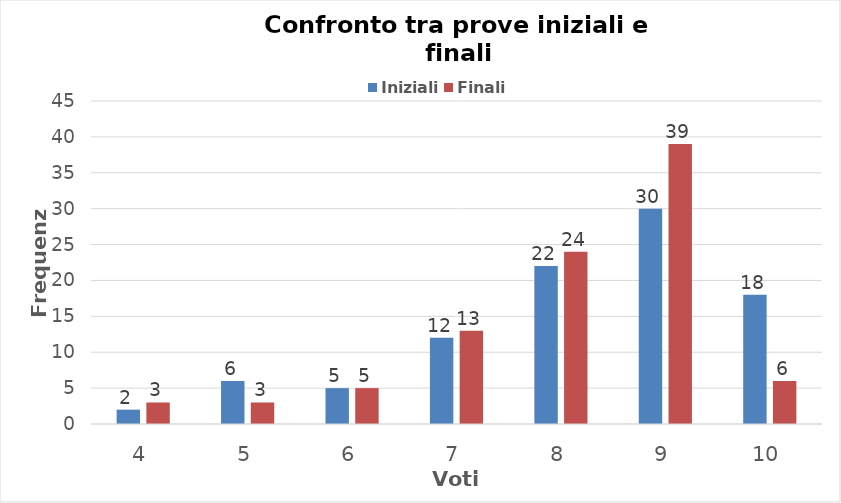
| Category | Iniziali | Finali |
|---|---|---|
| 4.0 | 2 | 3 |
| 5.0 | 6 | 3 |
| 6.0 | 5 | 5 |
| 7.0 | 12 | 13 |
| 8.0 | 22 | 24 |
| 9.0 | 30 | 39 |
| 10.0 | 18 | 6 |